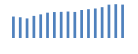
| Category | Exportações (1) |
|---|---|
| 0 | 595986.616 |
| 1 | 575965.577 |
| 2 | 544011.291 |
| 3 | 614380.205 |
| 4 | 656918.26 |
| 5 | 703504.835 |
| 6 | 720793.562 |
| 7 | 726284.803 |
| 8 | 735533.905 |
| 9 | 723973.625 |
| 10 | 778041 |
| 11 | 800341.537 |
| 12 | 819402.338 |
| 13 | 856189.676 |
| 14 | 925952.679 |
| 15 | 938963.288 |
| 16 | 927854.353 |